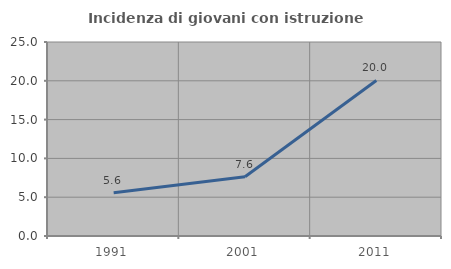
| Category | Incidenza di giovani con istruzione universitaria |
|---|---|
| 1991.0 | 5.581 |
| 2001.0 | 7.642 |
| 2011.0 | 20.049 |